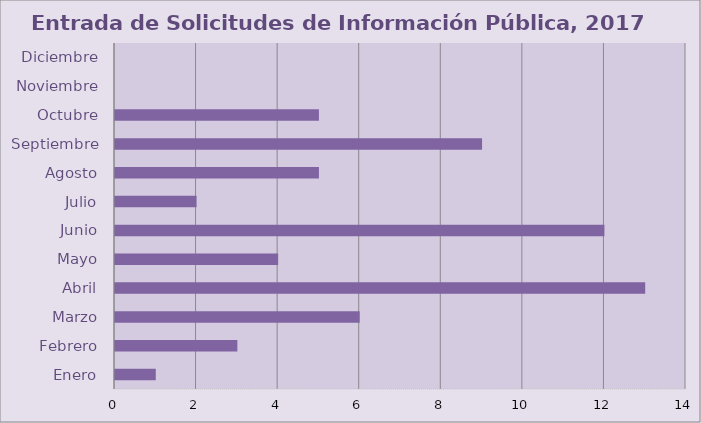
| Category | Series 0 |
|---|---|
| Enero | 1 |
| Febrero | 3 |
| Marzo | 6 |
| Abril | 13 |
| Mayo | 4 |
| Junio | 12 |
| Julio | 2 |
| Agosto | 5 |
| Septiembre | 9 |
| Octubre | 5 |
| Noviembre | 0 |
| Diciembre | 0 |